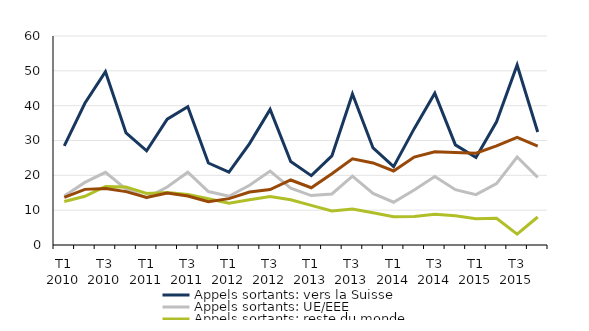
| Category | Appels sortants: vers la Suisse | Appels sortants: UE/EEE | Appels sortants: reste du monde |  Anglais : "special corporate"
 |
|---|---|---|---|---|
| T1 2010 | 28.477 | 14.043 | 12.489 | 13.652 |
| T2 2010 | 40.682 | 17.976 | 13.986 | 15.97 |
| T3 2010 | 49.76 | 20.857 | 16.822 | 16.244 |
| T4 2010 | 32.182 | 16.05 | 16.647 | 15.322 |
| T1 2011 | 27.028 | 13.521 | 14.802 | 13.655 |
| T2 2011 | 36.123 | 16.639 | 15.063 | 14.947 |
| T3 2011 | 39.695 | 20.905 | 14.504 | 14.061 |
| T4 2011 | 23.538 | 15.355 | 13.262 | 12.398 |
| T1 2012 | 20.928 | 14.002 | 12.014 | 13.307 |
| T2 2012 | 29.105 | 17.135 | 12.979 | 15.196 |
| T3 2012 | 38.934 | 21.224 | 13.948 | 15.909 |
| T4 2012 | 23.94 | 16.329 | 13.001 | 18.661 |
| T1 2013 | 19.918 | 14.191 | 11.39 | 16.433 |
| T2 2013 | 25.585 | 14.657 | 9.773 | 20.455 |
| T3 2013 | 43.334 | 19.779 | 10.348 | 24.744 |
| T4 2013 | 27.865 | 14.812 | 9.282 | 23.559 |
| T1 2014 | 22.49 | 12.275 | 8.142 | 21.246 |
| T2 2014 | 33.407 | 15.78 | 8.206 | 25.237 |
| T3 2014 | 43.568 | 19.644 | 8.861 | 26.774 |
| T4 2014 | 28.737 | 15.874 | 8.377 | 26.556 |
| T1 2015 | 25.115 | 14.452 | 7.557 | 26.365 |
| T2 2015 | 35.362 | 17.622 | 7.694 | 28.469 |
| T3 2015 | 51.661 | 25.26 | 3.124 | 30.91 |
| T4 2015 | 32.442 | 19.399 | 8.036 | 28.397 |